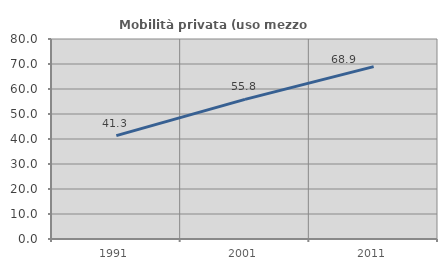
| Category | Mobilità privata (uso mezzo privato) |
|---|---|
| 1991.0 | 41.338 |
| 2001.0 | 55.844 |
| 2011.0 | 68.95 |